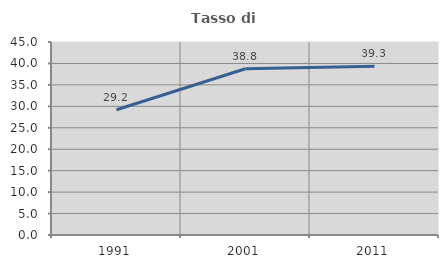
| Category | Tasso di occupazione   |
|---|---|
| 1991.0 | 29.202 |
| 2001.0 | 38.767 |
| 2011.0 | 39.329 |